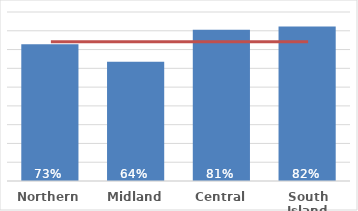
| Category | Pacific |
|---|---|
| Northern | 0.729 |
| Midland | 0.636 |
| Central | 0.805 |
| South Island | 0.823 |